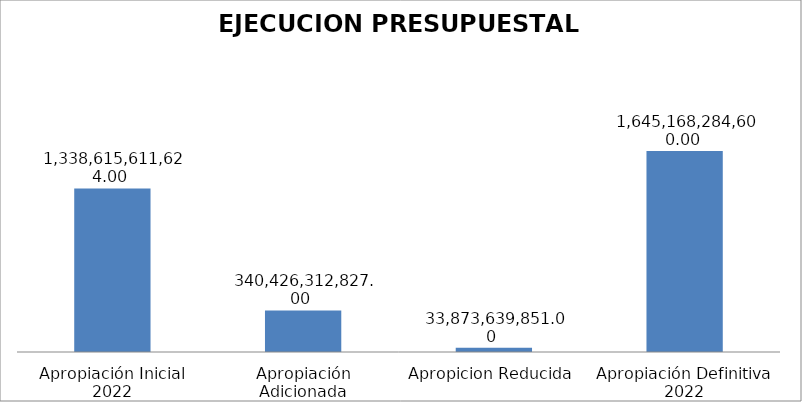
| Category | Series 0 |
|---|---|
| Apropiación Inicial 2022 | 1338615611624 |
| Apropiación Adicionada | 340426312827 |
| Apropicion Reducida | 33873639851 |
| Apropiación Definitiva 2022 | 1645168284600 |